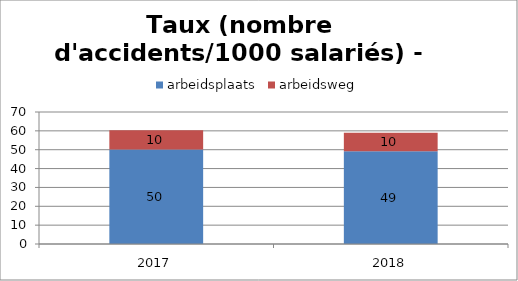
| Category | arbeidsplaats | arbeidsweg |
|---|---|---|
| 2017.0 | 50.092 | 10.203 |
| 2018.0 | 49.184 | 9.774 |